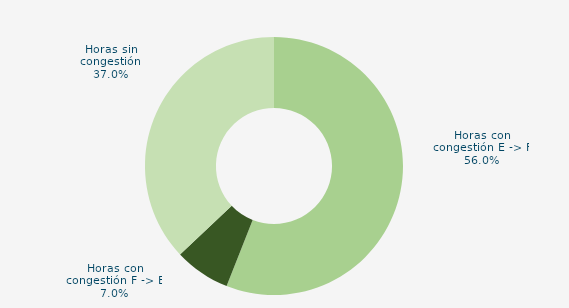
| Category | Horas con congestión E -> F |
|---|---|
| Horas con congestión E -> F | 55.989 |
| Horas con congestión F -> E | 6.999 |
| Horas sin congestión | 37.012 |